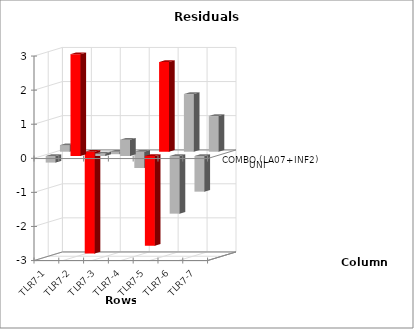
| Category | UNI | COMBO (LA07+INF2) |
|---|---|---|
| TLR7-1 | -0.193 | 0.193 |
| TLR7-2 | 2.989 | -2.989 |
| TLR7-3 | 0.073 | -0.073 |
| TLR7-4 | 0.479 | -0.479 |
| TLR7-5 | -2.631 | 2.631 |
| TLR7-6 | -1.692 | 1.692 |
| TLR7-7 | -1.046 | 1.046 |